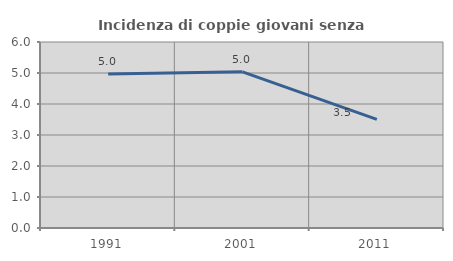
| Category | Incidenza di coppie giovani senza figli |
|---|---|
| 1991.0 | 4.971 |
| 2001.0 | 5.039 |
| 2011.0 | 3.505 |